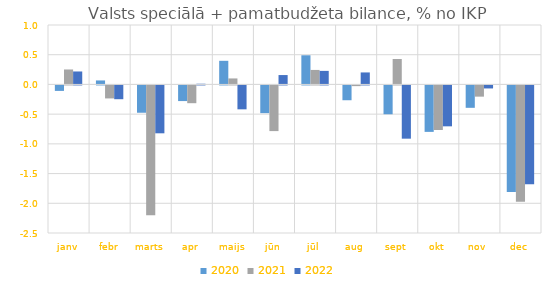
| Category | 2020 | 2021 | 2022 |
|---|---|---|---|
| janv | -0.092 | 0.252 | 0.218 |
| febr | 0.067 | -0.219 | -0.232 |
| marts | -0.46 | -2.186 | -0.806 |
| apr | -0.263 | -0.299 | 0.011 |
| maijs | 0.397 | 0.101 | -0.402 |
| jūn | -0.466 | -0.768 | 0.158 |
| jūl | 0.49 | 0.244 | 0.228 |
| aug | -0.249 | -0.012 | 0.202 |
| sept | -0.485 | 0.428 | -0.896 |
| okt | -0.782 | -0.75 | -0.688 |
| nov | -0.377 | -0.189 | -0.051 |
| dec | -1.793 | -1.958 | -1.661 |